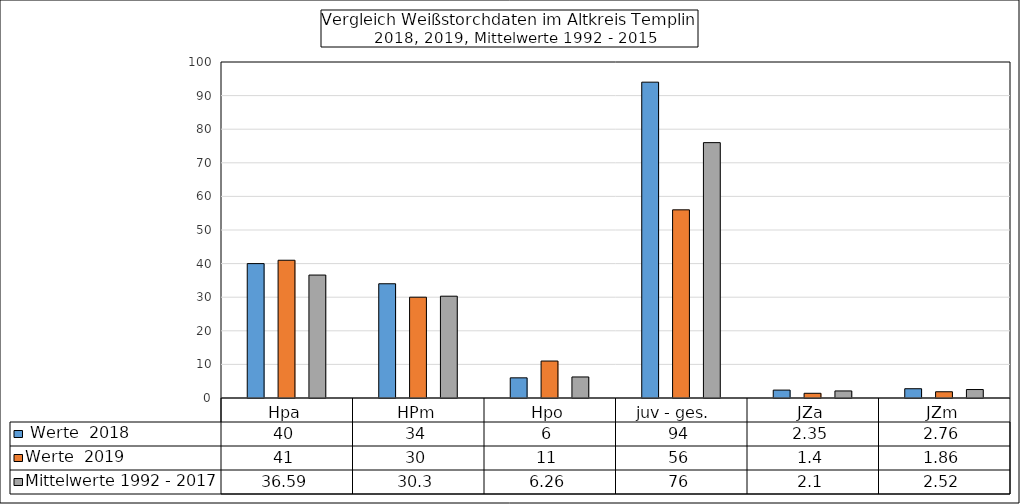
| Category |  Werte  2018 | Werte  2019 | Mittelwerte 1992 - 2017 |
|---|---|---|---|
| Hpa | 40 | 41 | 36.59 |
| HPm | 34 | 30 | 30.3 |
| Hpo | 6 | 11 | 6.26 |
| juv - ges.   | 94 | 56 | 76 |
| JZa | 2.35 | 1.4 | 2.1 |
| JZm | 2.76 | 1.86 | 2.52 |